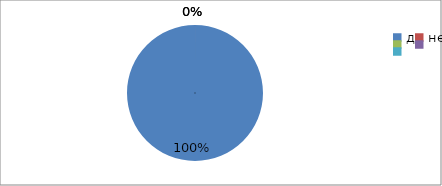
| Category | Series 0 | Series 1 |
|---|---|---|
| да | 100 | 100 |
| нет | 0 | 0 |